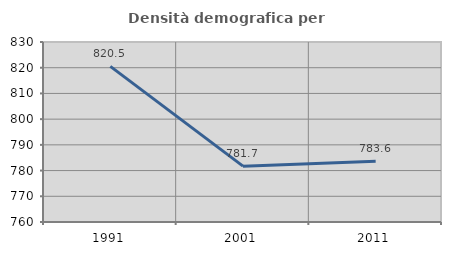
| Category | Densità demografica |
|---|---|
| 1991.0 | 820.513 |
| 2001.0 | 781.719 |
| 2011.0 | 783.579 |